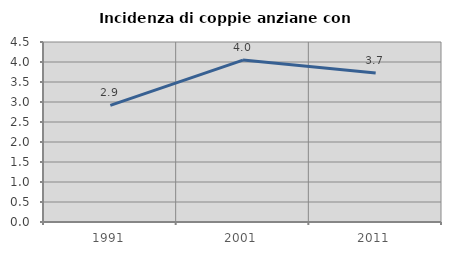
| Category | Incidenza di coppie anziane con figli |
|---|---|
| 1991.0 | 2.915 |
| 2001.0 | 4.049 |
| 2011.0 | 3.725 |